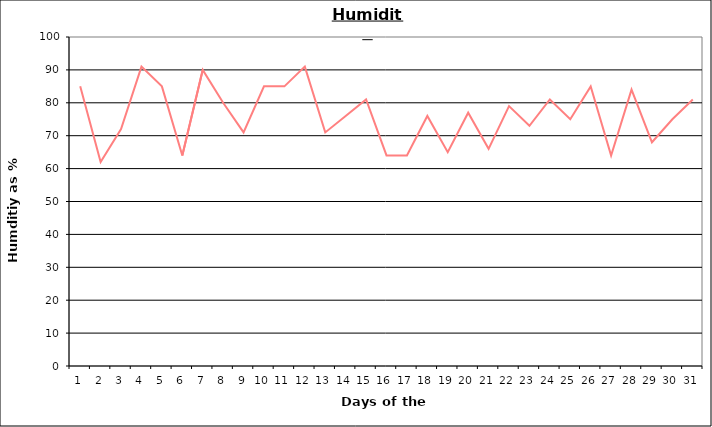
| Category | Series 0 |
|---|---|
| 0 | 85 |
| 1 | 62 |
| 2 | 72 |
| 3 | 91 |
| 4 | 85 |
| 5 | 64 |
| 6 | 90 |
| 7 | 80 |
| 8 | 71 |
| 9 | 85 |
| 10 | 85 |
| 11 | 91 |
| 12 | 71 |
| 13 | 76 |
| 14 | 81 |
| 15 | 64 |
| 16 | 64 |
| 17 | 76 |
| 18 | 65 |
| 19 | 77 |
| 20 | 66 |
| 21 | 79 |
| 22 | 73 |
| 23 | 81 |
| 24 | 75 |
| 25 | 85 |
| 26 | 64 |
| 27 | 84 |
| 28 | 68 |
| 29 | 75 |
| 30 | 81 |